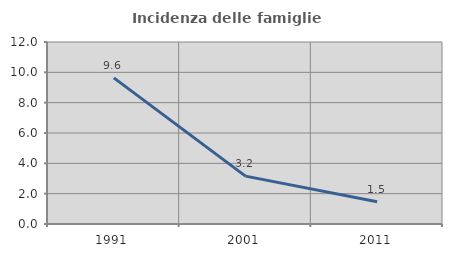
| Category | Incidenza delle famiglie numerose |
|---|---|
| 1991.0 | 9.633 |
| 2001.0 | 3.156 |
| 2011.0 | 1.472 |